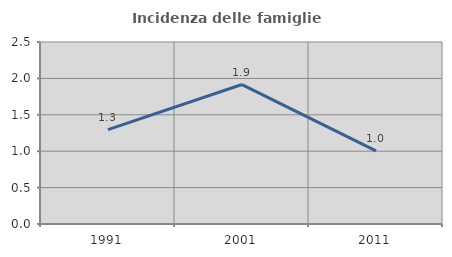
| Category | Incidenza delle famiglie numerose |
|---|---|
| 1991.0 | 1.296 |
| 2001.0 | 1.916 |
| 2011.0 | 1.004 |